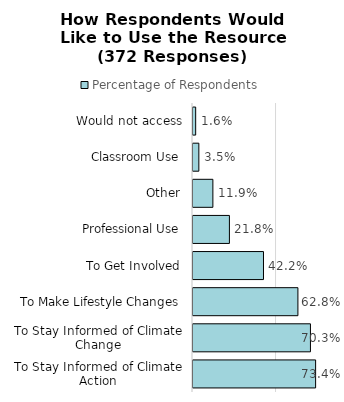
| Category | Percentage of Respondents |
|---|---|
| To Stay Informed of Climate Action | 0.734 |
| To Stay Informed of Climate Change | 0.703 |
| To Make Lifestyle Changes | 0.628 |
| To Get Involved | 0.422 |
| Professional Use | 0.218 |
| Other | 0.119 |
| Classroom Use | 0.035 |
| Would not access | 0.016 |